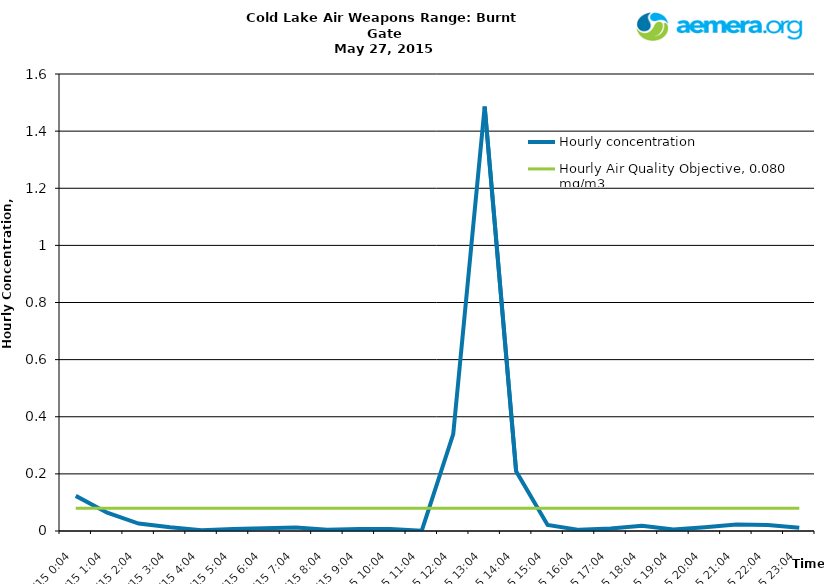
| Category | Hourly concentration | Hourly Air Quality Objective, 0.080 mg/m3 |
|---|---|---|
| 5/27/15 | 0.123 | 0.08 |
| 5/27/15 | 0.064 | 0.08 |
| 5/27/15 | 0.026 | 0.08 |
| 5/27/15 | 0.013 | 0.08 |
| 5/27/15 | 0.003 | 0.08 |
| 5/27/15 | 0.007 | 0.08 |
| 5/27/15 | 0.01 | 0.08 |
| 5/27/15 | 0.012 | 0.08 |
| 5/27/15 | 0.004 | 0.08 |
| 5/27/15 | 0.007 | 0.08 |
| 5/27/15 | 0.007 | 0.08 |
| 5/27/15 | 0.001 | 0.08 |
| 5/27/15 | 0.339 | 0.08 |
| 5/27/15 | 1.486 | 0.08 |
| 5/27/15 | 0.209 | 0.08 |
| 5/27/15 | 0.021 | 0.08 |
| 5/27/15 | 0.004 | 0.08 |
| 5/27/15 | 0.009 | 0.08 |
| 5/27/15 | 0.018 | 0.08 |
| 5/27/15 | 0.005 | 0.08 |
| 5/27/15 | 0.013 | 0.08 |
| 5/27/15 | 0.023 | 0.08 |
| 5/27/15 | 0.021 | 0.08 |
| 5/27/15 | 0.011 | 0.08 |